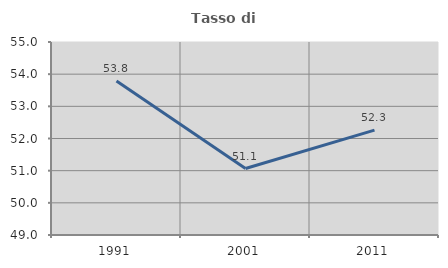
| Category | Tasso di occupazione   |
|---|---|
| 1991.0 | 53.79 |
| 2001.0 | 51.066 |
| 2011.0 | 52.26 |